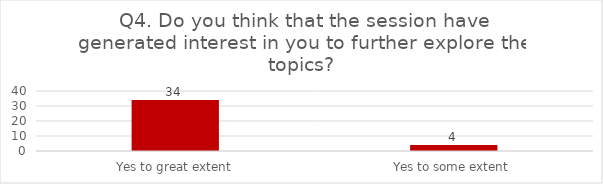
| Category | Q4. Do you think that the session have generated interest in you to further explore the topics? |
|---|---|
| Yes to great extent | 34 |
| Yes to some extent | 4 |